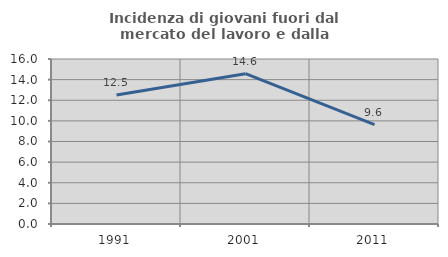
| Category | Incidenza di giovani fuori dal mercato del lavoro e dalla formazione  |
|---|---|
| 1991.0 | 12.5 |
| 2001.0 | 14.575 |
| 2011.0 | 9.633 |